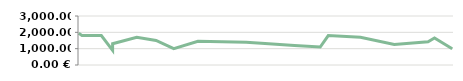
| Category | RECEITAS |
|---|---|
| 2013-04-23 | 1950 |
| 2013-04-25 | 1800 |
| 2013-05-07 | 1800 |
| 2013-05-14 | 900 |
| 2013-05-14 | 1300 |
| 2013-05-29 | 1700 |
| 2013-06-10 | 1500 |
| 2013-06-21 | 1000 |
| 2013-07-06 | 1450 |
| 2013-08-05 | 1400 |
| 2013-08-19 | 1300 |
| 2013-09-04 | 1200 |
| 2013-09-20 | 1100 |
| 2013-09-25 | 1800 |
| 2013-10-15 | 1700 |
| 2013-11-05 | 1250 |
| 2013-11-26 | 1425 |
| 2013-11-30 | 1650 |
| 2013-12-11 | 1000 |